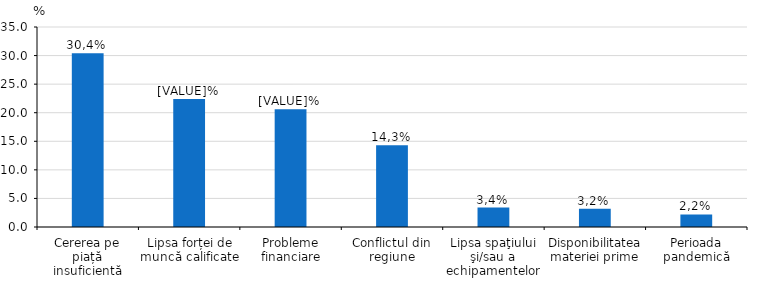
| Category | Series 0 |
|---|---|
| Cererea pe piață insuficientă | 30.4 |
| Lipsa forței de muncă calificate | 22.4 |
| Probleme financiare | 20.6 |
| Conflictul din regiune | 14.3 |
| Lipsa spaţiului şi/sau a echipamentelor | 3.4 |
| Disponibilitatea materiei prime | 3.2 |
| Perioada pandemică | 2.2 |